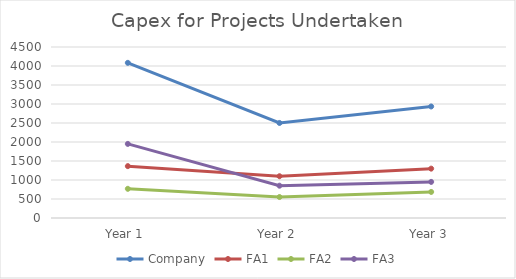
| Category | Company | FA1 | FA2 | FA3 |
|---|---|---|---|---|
| Year 1 | 4083 | 1365 | 768 | 1950 |
| Year 2 | 2501 | 1099 | 552 | 850 |
| Year 3 | 2935 | 1299 | 686 | 950 |